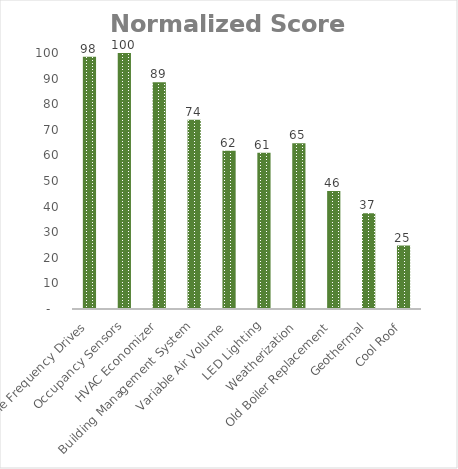
| Category | Normalized Score (0-100)  |
|---|---|
| Variable Frequency Drives | 98.494 |
| Occupancy Sensors | 100 |
| HVAC Economizer | 88.554 |
| Building Management System | 73.892 |
| Variable Air Volume | 61.854 |
| LED Lighting | 61.003 |
| Weatherization | 64.731 |
| Old Boiler Replacement | 46.065 |
| Geothermal | 37.382 |
| Cool Roof | 24.799 |